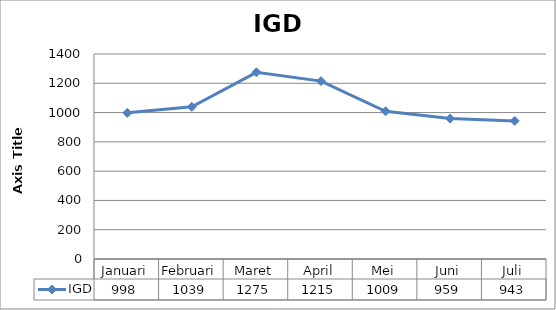
| Category | IGD |
|---|---|
| 0 | 998 |
| 1 | 1039 |
| 2 | 1275 |
| 3 | 1215 |
| 4 | 1009 |
| 5 | 959 |
| 6 | 943 |